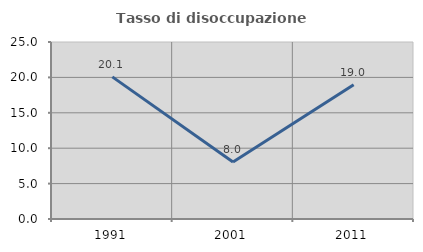
| Category | Tasso di disoccupazione giovanile  |
|---|---|
| 1991.0 | 20.076 |
| 2001.0 | 8.046 |
| 2011.0 | 18.966 |